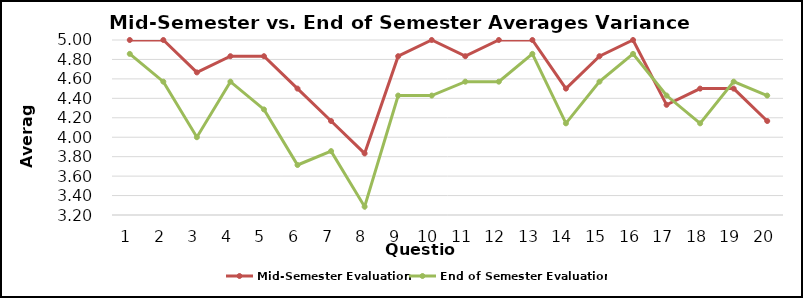
| Category | Mid-Semester Evaluation | End of Semester Evaluation |
|---|---|---|
| 0 | 5 | 4.857 |
| 1 | 5 | 4.571 |
| 2 | 4.667 | 4 |
| 3 | 4.833 | 4.571 |
| 4 | 4.833 | 4.286 |
| 5 | 4.5 | 3.714 |
| 6 | 4.167 | 3.857 |
| 7 | 3.833 | 3.286 |
| 8 | 4.833 | 4.429 |
| 9 | 5 | 4.429 |
| 10 | 4.833 | 4.571 |
| 11 | 5 | 4.571 |
| 12 | 5 | 4.857 |
| 13 | 4.5 | 4.143 |
| 14 | 4.833 | 4.571 |
| 15 | 5 | 4.857 |
| 16 | 4.333 | 4.429 |
| 17 | 4.5 | 4.143 |
| 18 | 4.5 | 4.571 |
| 19 | 4.167 | 4.429 |